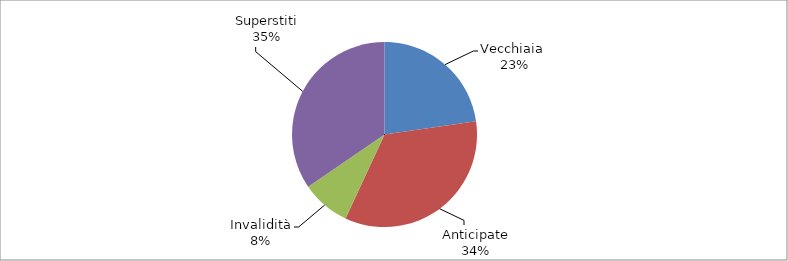
| Category | Series 0 |
|---|---|
| Vecchiaia  | 65859 |
| Anticipate | 99077 |
| Invalidità | 24697 |
| Superstiti | 100105 |